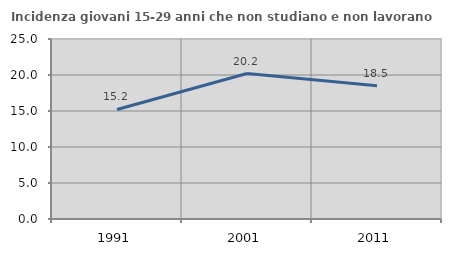
| Category | Incidenza giovani 15-29 anni che non studiano e non lavorano  |
|---|---|
| 1991.0 | 15.217 |
| 2001.0 | 20.202 |
| 2011.0 | 18.497 |